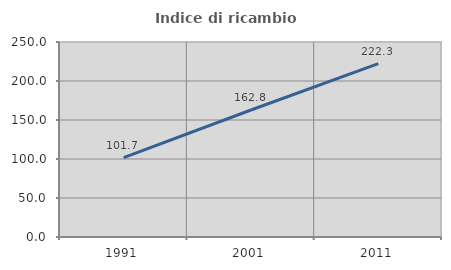
| Category | Indice di ricambio occupazionale  |
|---|---|
| 1991.0 | 101.709 |
| 2001.0 | 162.784 |
| 2011.0 | 222.254 |